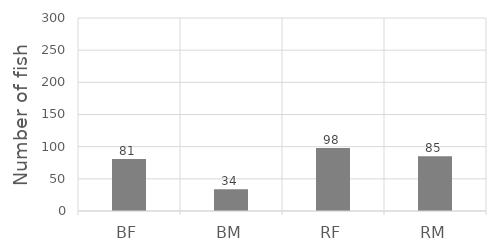
| Category | Series 0 |
|---|---|
| BF | 81 |
| BM | 34 |
| RF | 98 |
| RM | 85 |